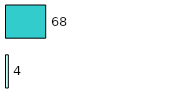
| Category | Series 0 | Series 1 |
|---|---|---|
| 0 | 4 | 68 |